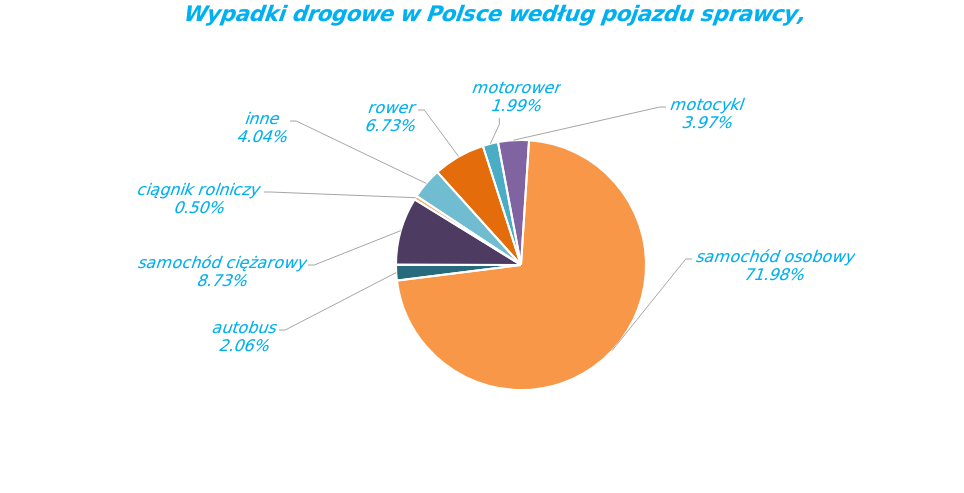
| Category | Series 0 |
|---|---|
| rower | 1304 |
| motorower | 385 |
| motocykl | 770 |
| samochód osobowy | 13945 |
| autobus | 399 |
| samochód ciężarowy | 1691 |
| ciągnik rolniczy | 97 |
| inne | 782 |